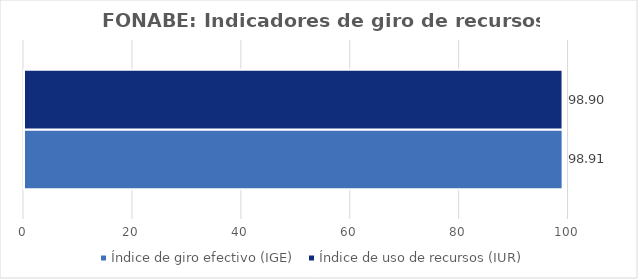
| Category | Índice de giro efectivo (IGE) | Índice de uso de recursos (IUR)  |
|---|---|---|
| 0 | 98.913 | 98.9 |